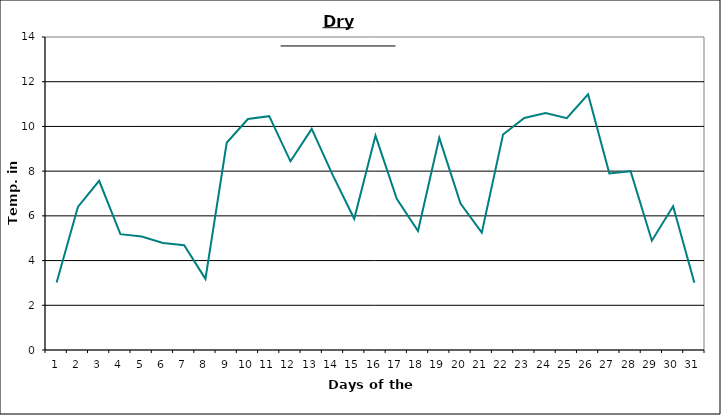
| Category | Series 0 |
|---|---|
| 0 | 3.02 |
| 1 | 6.4 |
| 2 | 7.57 |
| 3 | 5.18 |
| 4 | 5.08 |
| 5 | 4.79 |
| 6 | 4.69 |
| 7 | 3.18 |
| 8 | 9.27 |
| 9 | 10.33 |
| 10 | 10.46 |
| 11 | 8.44 |
| 12 | 9.89 |
| 13 | 7.8 |
| 14 | 5.87 |
| 15 | 9.59 |
| 16 | 6.76 |
| 17 | 5.32 |
| 18 | 9.49 |
| 19 | 6.55 |
| 20 | 5.25 |
| 21 | 9.64 |
| 22 | 10.38 |
| 23 | 10.6 |
| 24 | 10.37 |
| 25 | 11.44 |
| 26 | 7.9 |
| 27 | 8 |
| 28 | 4.89 |
| 29 | 6.43 |
| 30 | 3.01 |